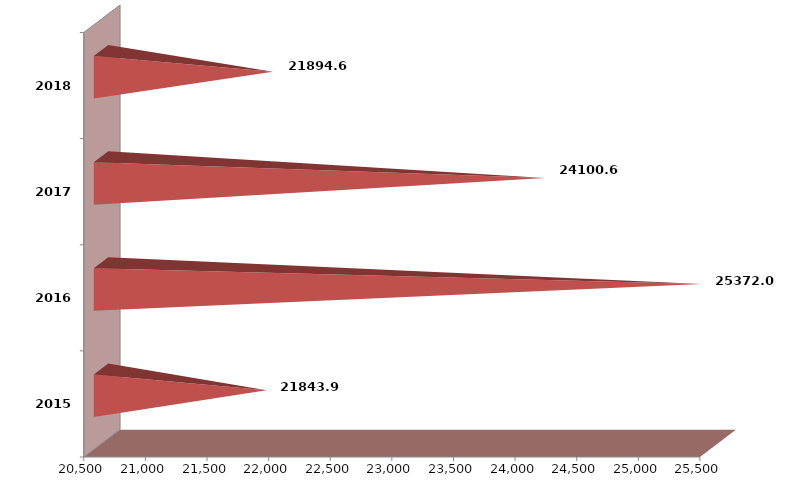
| Category | Series 1 |
|---|---|
| 2015 | 21843939 |
| 2016 | 25371970 |
| 2017 | 24100596 |
| 2018 | 21894629 |